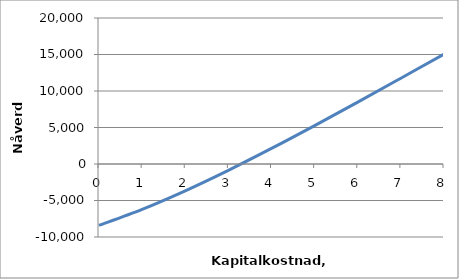
| Category | Series 0 |
|---|---|
| 0.0 | -8400 |
| 1.0 | -6207.725 |
| 2.0 | -3667.911 |
| 3.0 | -865.196 |
| 4.0 | 2130.653 |
| 5.0 | 5262.273 |
| 6.0 | 8482.643 |
| 7.0 | 11753.371 |
| 8.0 | 15043.254 |